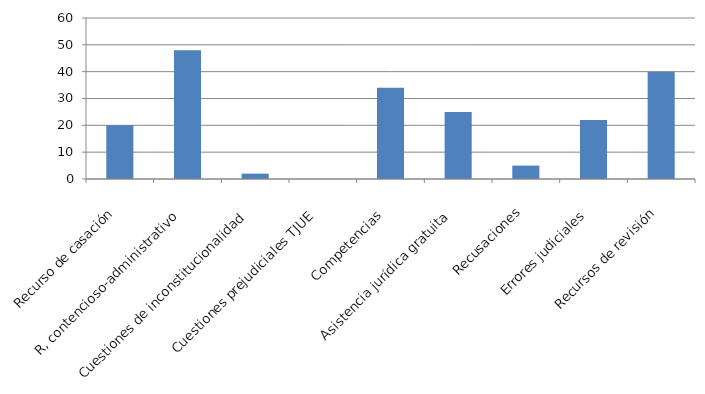
| Category | Series 0 |
|---|---|
| Recurso de casación | 20 |
| R, contencioso-administrativo  | 48 |
| Cuestiones de inconstitucionalidad  | 2 |
| Cuestiones prejudiciales TJUE  | 0 |
| Competencias  | 34 |
| Asistencia jurídica gratuita  | 25 |
| Recusaciones  | 5 |
| Errores judiciales  | 22 |
| Recursos de revisión | 40 |